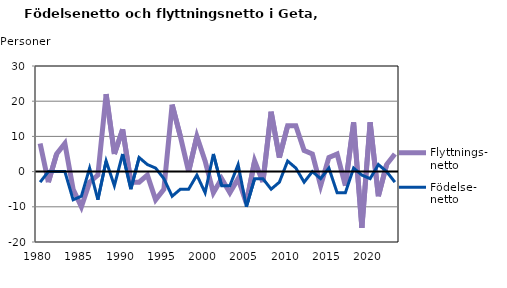
| Category | Flyttnings- netto | Födelse- netto |
|---|---|---|
| 1980.0 | 8 | -3 |
| 1981.0 | -3 | 0 |
| 1982.0 | 5 | 0 |
| 1983.0 | 8 | 0 |
| 1984.0 | -5 | -8 |
| 1985.0 | -10 | -7 |
| 1986.0 | -3 | 1 |
| 1987.0 | -1 | -8 |
| 1988.0 | 22 | 3 |
| 1989.0 | 5 | -4 |
| 1990.0 | 12 | 5 |
| 1991.0 | -3 | -5 |
| 1992.0 | -3 | 4 |
| 1993.0 | -1 | 2 |
| 1994.0 | -8 | 1 |
| 1995.0 | -5 | -2 |
| 1996.0 | 19 | -7 |
| 1997.0 | 10 | -5 |
| 1998.0 | 0 | -5 |
| 1999.0 | 10 | -1 |
| 2000.0 | 3 | -6 |
| 2001.0 | -6 | 5 |
| 2002.0 | -2 | -4 |
| 2003.0 | -6 | -4 |
| 2004.0 | -2 | 2 |
| 2005.0 | -9 | -10 |
| 2006.0 | 3 | -2 |
| 2007.0 | -3 | -2 |
| 2008.0 | 17 | -5 |
| 2009.0 | 4 | -3 |
| 2010.0 | 13 | 3 |
| 2011.0 | 13 | 1 |
| 2012.0 | 6 | -3 |
| 2013.0 | 5 | 0 |
| 2014.0 | -4 | -2 |
| 2015.0 | 4 | 1 |
| 2016.0 | 5 | -6 |
| 2017.0 | -4 | -6 |
| 2018.0 | 14 | 1 |
| 2019.0 | -16 | -1 |
| 2020.0 | 14 | -2 |
| 2021.0 | -7 | 2 |
| 2022.0 | 2 | 0 |
| 2023.0 | 5 | -3 |